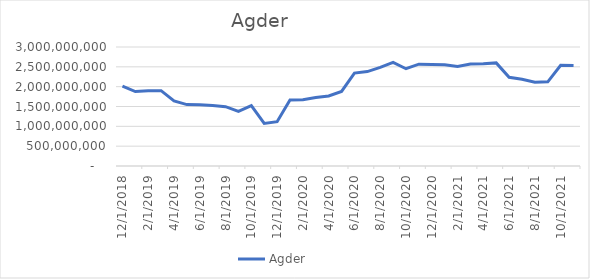
| Category | Agder |
|---|---|
| 12/1/18 | 2016467916.667 |
| 1/1/19 | 1876809583.333 |
| 2/1/19 | 1897459583.333 |
| 3/1/19 | 1899453333.333 |
| 4/1/19 | 1641920000 |
| 5/1/19 | 1548395000 |
| 6/1/19 | 1547053333.333 |
| 7/1/19 | 1522349166.667 |
| 8/1/19 | 1495962500 |
| 9/1/19 | 1376916666.667 |
| 10/1/19 | 1522929166.667 |
| 11/1/19 | 1073991666.667 |
| 12/1/19 | 1116495833.333 |
| 1/1/20 | 1664239583.333 |
| 2/1/20 | 1673218750 |
| 3/1/20 | 1725212916.667 |
| 4/1/20 | 1766721250 |
| 5/1/20 | 1880958750 |
| 6/1/20 | 2341696250 |
| 7/1/20 | 2380871250 |
| 8/1/20 | 2485783750 |
| 9/1/20 | 2613946250 |
| 10/1/20 | 2452187916.667 |
| 11/1/20 | 2567446250 |
| 12/1/20 | 2557654583.333 |
| 1/1/21 | 2550473333.333 |
| 2/1/21 | 2508436666.667 |
| 3/1/21 | 2569234166.667 |
| 4/1/21 | 2576763333.333 |
| 5/1/21 | 2599430000 |
| 6/1/21 | 2236030000 |
| 7/1/21 | 2185750833.333 |
| 8/1/21 | 2113896666.667 |
| 9/1/21 | 2121855000 |
| 10/1/21 | 2538230833.333 |
| 11/1/21 | 2532760000 |